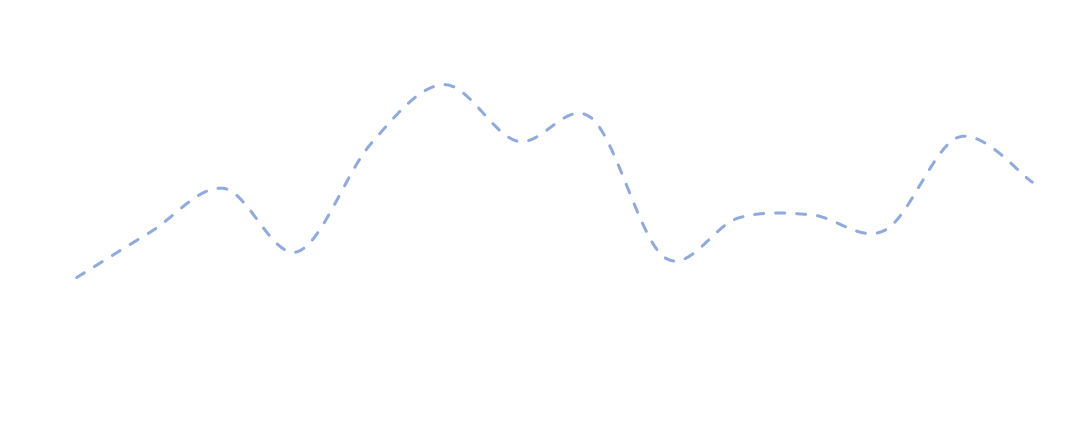
| Category | Series 0 |
|---|---|
| 0 | 23458.719 |
| 1 | 24252.704 |
| 2 | 25018.477 |
| 3 | 23908.736 |
| 4 | 25795.493 |
| 5 | 26834.71 |
| 6 | 25842.187 |
| 7 | 26253.007 |
| 8 | 23806.433 |
| 9 | 24500.298 |
| 10 | 24555.126 |
| 11 | 24289.103 |
| 12 | 25916.072 |
| 13 | 25127.86 |